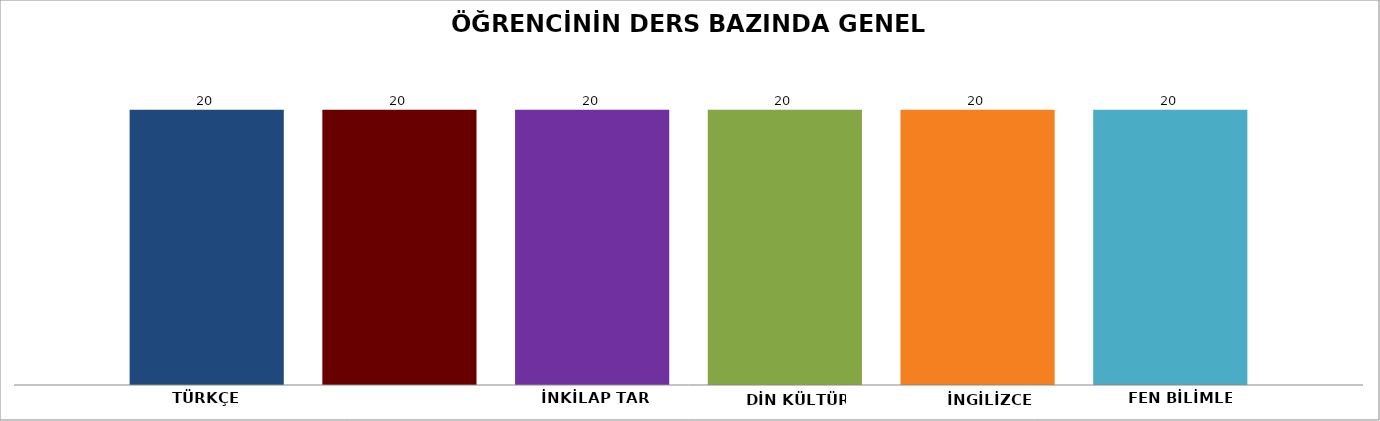
| Category | Series 0 | Series 1 | Series 2 | Series 3 | Series 4 | Series 5 |
|---|---|---|---|---|---|---|
|  | 20 | 20 | 20 | 20 | 20 | 20 |